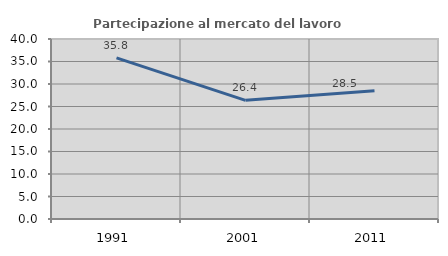
| Category | Partecipazione al mercato del lavoro  femminile |
|---|---|
| 1991.0 | 35.793 |
| 2001.0 | 26.367 |
| 2011.0 | 28.501 |